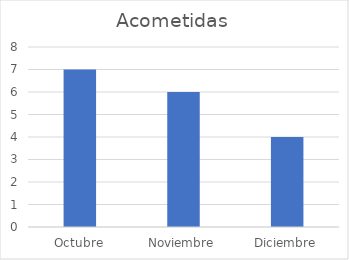
| Category | Acometidas |
|---|---|
| Octubre | 7 |
| Noviembre | 6 |
| Diciembre | 4 |